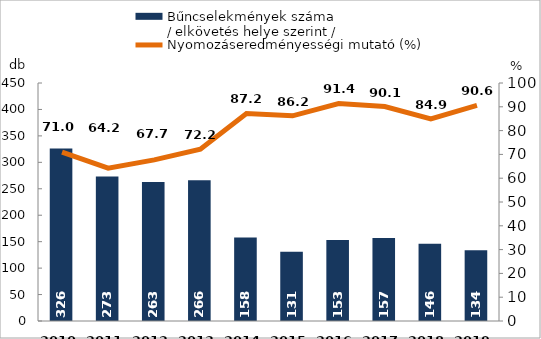
| Category | Bűncselekmények száma
/ elkövetés helye szerint / |
|---|---|
| 2010. év | 326 |
| 2011. év | 273 |
| 2012. év | 263 |
| 2013. év | 266 |
| 2014. év | 158 |
| 2015. év | 131 |
| 2016. év | 153 |
| 2017. év | 157 |
| 2018. év | 146 |
| 2019. év | 134 |